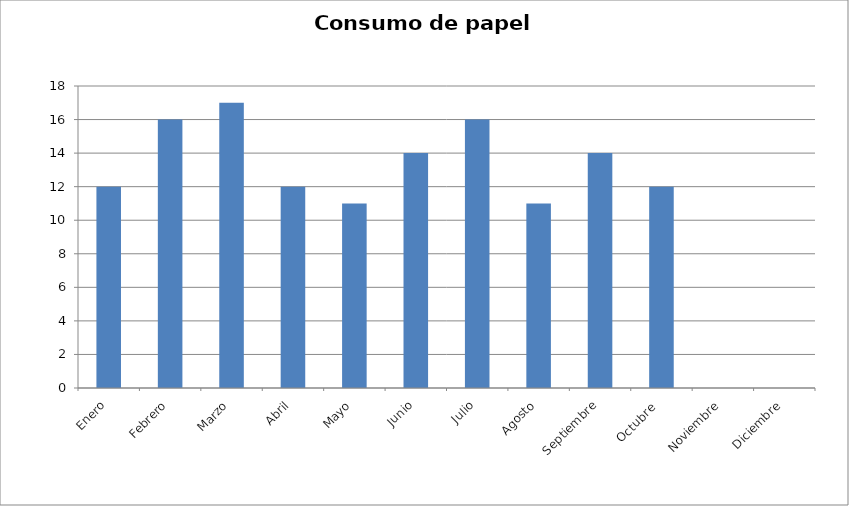
| Category | Series 0 |
|---|---|
| Enero | 12 |
| Febrero | 16 |
| Marzo | 17 |
| Abril | 12 |
| Mayo | 11 |
| Junio | 14 |
| Julio | 16 |
| Agosto | 11 |
| Septiembre | 14 |
| Octubre  | 12 |
| Noviembre | 0 |
| Diciembre | 0 |